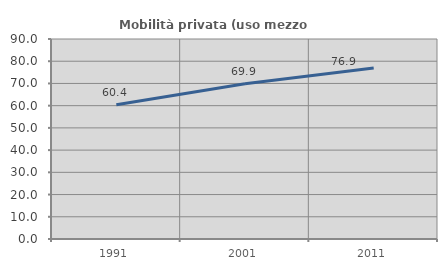
| Category | Mobilità privata (uso mezzo privato) |
|---|---|
| 1991.0 | 60.366 |
| 2001.0 | 69.886 |
| 2011.0 | 76.901 |